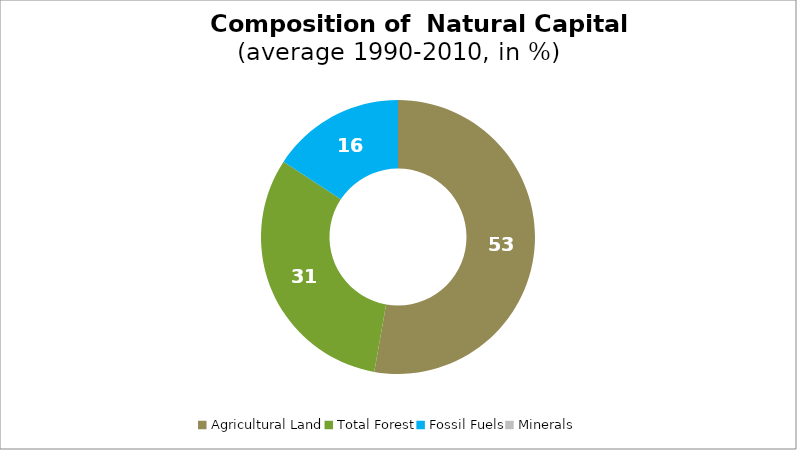
| Category | Series 0 |
|---|---|
| Agricultural Land | 52.776 |
| Total Forest | 31.489 |
| Fossil Fuels | 15.735 |
| Minerals | 0 |